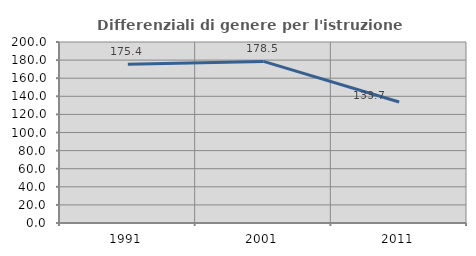
| Category | Differenziali di genere per l'istruzione superiore |
|---|---|
| 1991.0 | 175.403 |
| 2001.0 | 178.535 |
| 2011.0 | 133.651 |